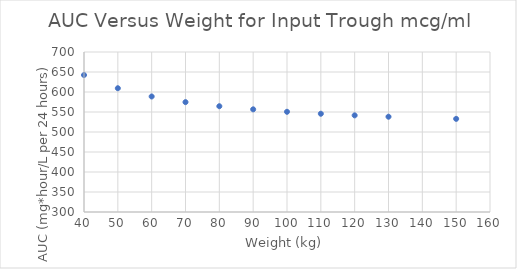
| Category | Series 0 |
|---|---|
| 40.0 | 642.414 |
| 50.0 | 609.433 |
| 60.0 | 588.805 |
| 70.0 | 574.7 |
| 80.0 | 564.452 |
| 90.0 | 556.671 |
| 100.0 | 550.564 |
| 110.0 | 545.643 |
| 120.0 | 541.594 |
| 130.0 | 538.205 |
| 150.0 | 532.849 |